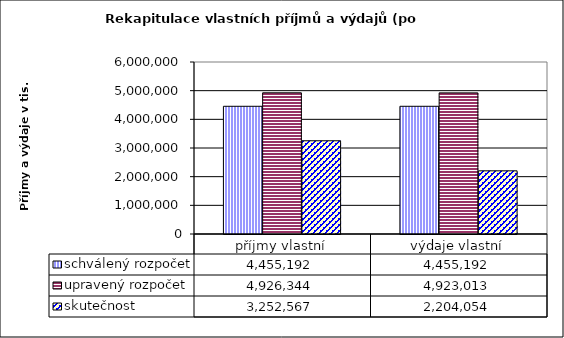
| Category | schválený rozpočet | upravený rozpočet | skutečnost |
|---|---|---|---|
| příjmy vlastní | 4455192 | 4926344 | 3252567 |
| výdaje vlastní | 4455192 | 4923013 | 2204054 |